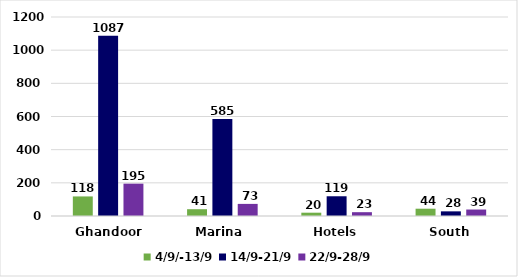
| Category | 4/9/-13/9 | 14/9-21/9 | 22/9-28/9 |
|---|---|---|---|
| Ghandoor  | 118 | 1087 | 195 |
| Marina  | 41 | 585 | 73 |
| Hotels | 20 | 119 | 23 |
| South | 44 | 28 | 39 |